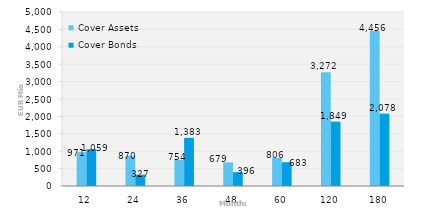
| Category | Cover Assets | Cover Bonds |
|---|---|---|
| 12.0 | 971.28 | 1059.16 |
| 24.0 | 869.62 | 326.5 |
| 36.0 | 754.43 | 1383.32 |
| 48.0 | 678.59 | 396.3 |
| 60.0 | 806.08 | 682.8 |
| 120.0 | 3271.56 | 1848.62 |
| 180.0 | 4456.02 | 2078.37 |